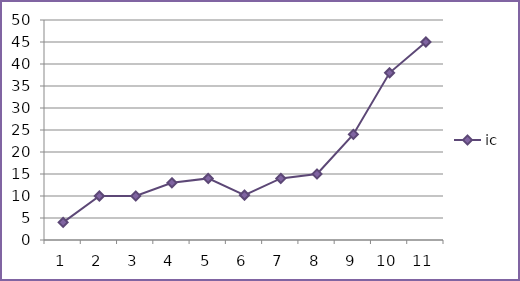
| Category | ic |
|---|---|
| 0 | 4 |
| 1 | 10 |
| 2 | 10 |
| 3 | 13 |
| 4 | 14 |
| 5 | 10.2 |
| 6 | 14 |
| 7 | 15 |
| 8 | 24 |
| 9 | 38 |
| 10 | 45 |